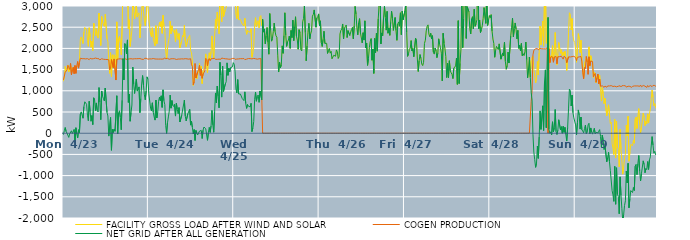
| Category | FACILITY GROSS LOAD AFTER WIND AND SOLAR | COGEN PRODUCTION | NET GRID AFTER ALL GENERATION |
|---|---|---|---|
|  Mon  4/23 | 1224 | 1258 | -34 |
|  Mon  4/23 | 1324 | 1263 | 61 |
|  Mon  4/23 | 1573 | 1440 | 133 |
|  Mon  4/23 | 1458 | 1420 | 38 |
|  Mon  4/23 | 1492 | 1490 | 2 |
|  Mon  4/23 | 1609 | 1601 | 8 |
|  Mon  4/23 | 1447 | 1546 | -99 |
|  Mon  4/23 | 1487 | 1502 | -15 |
|  Mon  4/23 | 1619 | 1644 | -25 |
|  Mon  4/23 | 1433 | 1376 | 57 |
|  Mon  4/23 | 1487 | 1495 | -8 |
|  Mon  4/23 | 1557 | 1555 | 2 |
|  Mon  4/23 | 1492 | 1404 | 88 |
|  Mon  4/23 | 1419 | 1596 | -177 |
|  Mon  4/23 | 1540 | 1411 | 129 |
|  Mon  4/23 | 1575 | 1593 | -18 |
|  Mon  4/23 | 1581 | 1691 | -110 |
|  Mon  4/23 | 1616 | 1535 | 81 |
|  Mon  4/23 | 1682 | 1666 | 16 |
|  Mon  4/23 | 2218 | 1769 | 449 |
|  Mon  4/23 | 2270 | 1766 | 504 |
|  Mon  4/23 | 2256 | 1757 | 499 |
|  Mon  4/23 | 2114 | 1761 | 353 |
|  Mon  4/23 | 2384 | 1758 | 626 |
|  Mon  4/23 | 2494 | 1753 | 741 |
|  Mon  4/23 | 2471 | 1752 | 719 |
|  Mon  4/23 | 2440 | 1757 | 683 |
|  Mon  4/23 | 2184 | 1759 | 425 |
|  Mon  4/23 | 2049 | 1754 | 295 |
|  Mon  4/23 | 2487 | 1735 | 752 |
|  Mon  4/23 | 2272 | 1766 | 506 |
|  Mon  4/23 | 2027 | 1745 | 282 |
|  Mon  4/23 | 2168 | 1752 | 416 |
|  Mon  4/23 | 1950 | 1747 | 203 |
|  Mon  4/23 | 2594 | 1759 | 835 |
|  Mon  4/23 | 2545 | 1757 | 788 |
|  Mon  4/23 | 2304 | 1772 | 532 |
|  Mon  4/23 | 2463 | 1749 | 714 |
|  Mon  4/23 | 2291 | 1760 | 531 |
|  Mon  4/23 | 2243 | 1742 | 501 |
|  Mon  4/23 | 2831 | 1754 | 1077 |
|  Mon  4/23 | 2462 | 1730 | 732 |
|  Mon  4/23 | 2067 | 1749 | 318 |
|  Mon  4/23 | 2753 | 1757 | 996 |
|  Mon  4/23 | 2625 | 1754 | 871 |
|  Mon  4/23 | 2557 | 1744 | 813 |
|  Mon  4/23 | 2520 | 1759 | 761 |
|  Mon  4/23 | 2805 | 1740 | 1065 |
|  Mon  4/23 | 2821 | 1747 | 1074 |
|  Mon  4/23 | 2226 | 1738 | 488 |
|  Mon  4/23 | 2161 | 1755 | 406 |
|  Mon  4/23 | 1663 | 1731 | -68 |
|  Mon  4/23 | 1410 | 1495 | -85 |
|  Mon  4/23 | 1898 | 1528 | 370 |
|  Mon  4/23 | 1334 | 1737 | -403 |
|  Mon  4/23 | 1848 | 1758 | 90 |
|  Mon  4/23 | 1560 | 1546 | 14 |
|  Mon  4/23 | 1849 | 1751 | 98 |
|  Mon  4/23 | 1805 | 1761 | 44 |
|  Mon  4/23 | 1285 | 1254 | 31 |
|  Mon  4/23 | 2626 | 1743 | 883 |
|  Mon  4/23 | 1738 | 1755 | -17 |
|  Mon  4/23 | 2224 | 1750 | 474 |
|  Mon  4/23 | 2280 | 1752 | 528 |
|  Mon  4/23 | 2127 | 1755 | 372 |
|  Mon  4/23 | 1849 | 1768 | 81 |
|  Mon  4/23 | 2524 | 1747 | 777 |
|  Mon  4/23 | 3503 | 1745 | 1758 |
|  Mon  4/23 | 3002 | 1745 | 1257 |
|  Mon  4/23 | 3884 | 1770 | 2114 |
|  Mon  4/23 | 3828 | 1743 | 2085 |
|  Mon  4/23 | 3609 | 1740 | 1869 |
|  Mon  4/23 | 3942 | 1742 | 2200 |
|  Mon  4/23 | 2467 | 1741 | 726 |
|  Mon  4/23 | 2677 | 1753 | 924 |
|  Mon  4/23 | 2046 | 1764 | 282 |
|  Mon  4/23 | 2242 | 1757 | 485 |
|  Mon  4/23 | 2431 | 1766 | 665 |
|  Mon  4/23 | 3309 | 1750 | 1559 |
|  Mon  4/23 | 2907 | 1746 | 1161 |
|  Mon  4/23 | 2694 | 1757 | 937 |
|  Mon  4/23 | 2708 | 1753 | 955 |
|  Mon  4/23 | 3032 | 1756 | 1276 |
|  Mon  4/23 | 2739 | 1747 | 992 |
|  Mon  4/23 | 2803 | 1758 | 1045 |
|  Mon  4/23 | 2839 | 1747 | 1092 |
|  Mon  4/23 | 2246 | 1761 | 485 |
|  Mon  4/23 | 2583 | 1764 | 819 |
|  Mon  4/23 | 2907 | 1746 | 1161 |
|  Mon  4/23 | 3126 | 1766 | 1360 |
|  Mon  4/23 | 2872 | 1739 | 1133 |
|  Mon  4/23 | 2668 | 1763 | 905 |
|  Mon  4/23 | 2533 | 1746 | 787 |
|  Mon  4/23 | 2763 | 1767 | 996 |
|  Mon  4/23 | 3099 | 1770 | 1329 |
|  Mon  4/23 | 3019 | 1746 | 1273 |
|  Tue  4/24 | 2692 | 1763 | 929 |
|  Tue  4/24 | 2679 | 1753 | 926 |
|  Tue  4/24 | 2330 | 1738 | 592 |
|  Tue  4/24 | 2276 | 1752 | 524 |
|  Tue  4/24 | 2486 | 1769 | 717 |
|  Tue  4/24 | 2255 | 1761 | 494 |
|  Tue  4/24 | 2138 | 1753 | 385 |
|  Tue  4/24 | 2060 | 1751 | 309 |
|  Tue  4/24 | 2536 | 1754 | 782 |
|  Tue  4/24 | 2108 | 1749 | 359 |
|  Tue  4/24 | 2256 | 1765 | 491 |
|  Tue  4/24 | 2502 | 1748 | 754 |
|  Tue  4/24 | 2614 | 1765 | 849 |
|  Tue  4/24 | 2516 | 1749 | 767 |
|  Tue  4/24 | 2634 | 1752 | 882 |
|  Tue  4/24 | 2355 | 1747 | 608 |
|  Tue  4/24 | 2782 | 1759 | 1023 |
|  Tue  4/24 | 2518 | 1754 | 764 |
|  Tue  4/24 | 2454 | 1779 | 675 |
|  Tue  4/24 | 1933 | 1755 | 178 |
|  Tue  4/24 | 1751 | 1756 | -5 |
|  Tue  4/24 | 2009 | 1765 | 244 |
|  Tue  4/24 | 2146 | 1762 | 384 |
|  Tue  4/24 | 2263 | 1743 | 520 |
|  Tue  4/24 | 2641 | 1743 | 898 |
|  Tue  4/24 | 2345 | 1755 | 590 |
|  Tue  4/24 | 2534 | 1763 | 771 |
|  Tue  4/24 | 2412 | 1757 | 655 |
|  Tue  4/24 | 2375 | 1746 | 629 |
|  Tue  4/24 | 2436 | 1755 | 681 |
|  Tue  4/24 | 2150 | 1746 | 404 |
|  Tue  4/24 | 2445 | 1739 | 706 |
|  Tue  4/24 | 2306 | 1742 | 564 |
|  Tue  4/24 | 2210 | 1749 | 461 |
|  Tue  4/24 | 2351 | 1746 | 605 |
|  Tue  4/24 | 2013 | 1749 | 264 |
|  Tue  4/24 | 2030 | 1764 | 266 |
|  Tue  4/24 | 2177 | 1754 | 423 |
|  Tue  4/24 | 2306 | 1760 | 546 |
|  Tue  4/24 | 2275 | 1751 | 524 |
|  Tue  4/24 | 2546 | 1765 | 781 |
|  Tue  4/24 | 2161 | 1758 | 403 |
|  Tue  4/24 | 2039 | 1749 | 290 |
|  Tue  4/24 | 2022 | 1753 | 269 |
|  Tue  4/24 | 2223 | 1758 | 465 |
|  Tue  4/24 | 2214 | 1746 | 468 |
|  Tue  4/24 | 2306 | 1742 | 564 |
|  Tue  4/24 | 1948 | 1757 | 191 |
|  Tue  4/24 | 1897 | 1614 | 283 |
|  Tue  4/24 | 1714 | 1578 | 136 |
|  Tue  4/24 | 1126 | 1145 | -19 |
|  Tue  4/24 | 1296 | 1210 | 86 |
|  Tue  4/24 | 1471 | 1643 | -172 |
|  Tue  4/24 | 1368 | 1303 | 65 |
|  Tue  4/24 | 1282 | 1280 | 2 |
|  Tue  4/24 | 1410 | 1450 | -40 |
|  Tue  4/24 | 1443 | 1506 | -63 |
|  Tue  4/24 | 1652 | 1603 | 49 |
|  Tue  4/24 | 1419 | 1364 | 55 |
|  Tue  4/24 | 1582 | 1516 | 66 |
|  Tue  4/24 | 1170 | 1295 | -125 |
|  Tue  4/24 | 1464 | 1394 | 70 |
|  Tue  4/24 | 1520 | 1374 | 146 |
|  Tue  4/24 | 1605 | 1468 | 137 |
|  Tue  4/24 | 1870 | 1766 | 104 |
|  Tue  4/24 | 1850 | 1742 | 108 |
|  Tue  4/24 | 1422 | 1590 | -168 |
|  Tue  4/24 | 1752 | 1737 | 15 |
|  Tue  4/24 | 1897 | 1761 | 136 |
|  Tue  4/24 | 1727 | 1708 | 19 |
|  Tue  4/24 | 1927 | 1755 | 172 |
|  Tue  4/24 | 2294 | 1757 | 537 |
|  Tue  4/24 | 1956 | 1760 | 196 |
|  Tue  4/24 | 1774 | 1752 | 22 |
|  Tue  4/24 | 2279 | 1766 | 513 |
|  Tue  4/24 | 2690 | 1741 | 949 |
|  Tue  4/24 | 2463 | 1748 | 715 |
|  Tue  4/24 | 2854 | 1743 | 1111 |
|  Tue  4/24 | 2636 | 1757 | 879 |
|  Tue  4/24 | 2345 | 1747 | 598 |
|  Tue  4/24 | 3431 | 1759 | 1672 |
|  Tue  4/24 | 3113 | 1743 | 1370 |
|  Tue  4/24 | 2624 | 1773 | 851 |
|  Tue  4/24 | 3351 | 1771 | 1580 |
|  Tue  4/24 | 2746 | 1762 | 984 |
|  Tue  4/24 | 2755 | 1752 | 1003 |
|  Tue  4/24 | 2916 | 1755 | 1161 |
|  Tue  4/24 | 2957 | 1743 | 1214 |
|  Tue  4/24 | 3411 | 1752 | 1659 |
|  Tue  4/24 | 3107 | 1743 | 1364 |
|  Tue  4/24 | 3280 | 1745 | 1535 |
|  Tue  4/24 | 3212 | 1766 | 1446 |
|  Tue  4/24 | 3293 | 1746 | 1547 |
|  Tue  4/24 | 3309 | 1746 | 1563 |
|  Tue  4/24 | 3326 | 1762 | 1564 |
|  Tue  4/24 | 3428 | 1764 | 1664 |
|  Wed  4/25 | 3392 | 1766 | 1626 |
|  Wed  4/25 | 3204 | 1742 | 1462 |
|  Wed  4/25 | 2805 | 1760 | 1045 |
|  Wed  4/25 | 2700 | 1749 | 951 |
|  Wed  4/25 | 3020 | 1756 | 1264 |
|  Wed  4/25 | 2677 | 1752 | 925 |
|  Wed  4/25 | 2658 | 1753 | 905 |
|  Wed  4/25 | 2682 | 1758 | 924 |
|  Wed  4/25 | 2687 | 1754 | 933 |
|  Wed  4/25 | 2577 | 1757 | 820 |
|  Wed  4/25 | 2563 | 1755 | 808 |
|  Wed  4/25 | 2529 | 1761 | 768 |
|  Wed  4/25 | 2711 | 1736 | 975 |
|  Wed  4/25 | 2457 | 1758 | 699 |
|  Wed  4/25 | 2332 | 1747 | 585 |
|  Wed  4/25 | 2427 | 1750 | 677 |
|  Wed  4/25 | 2398 | 1761 | 637 |
|  Wed  4/25 | 2405 | 1757 | 648 |
|  Wed  4/25 | 2380 | 1759 | 621 |
|  Wed  4/25 | 2465 | 1760 | 705 |
|  Wed  4/25 | 1791 | 1753 | 38 |
|  Wed  4/25 | 1892 | 1770 | 122 |
|  Wed  4/25 | 2039 | 1764 | 275 |
|  Wed  4/25 | 2548 | 1748 | 800 |
|  Wed  4/25 | 2725 | 1755 | 970 |
|  Wed  4/25 | 2515 | 1761 | 754 |
|  Wed  4/25 | 2613 | 1746 | 867 |
|  Wed  4/25 | 2656 | 1755 | 901 |
|  Wed  4/25 | 2483 | 1755 | 728 |
|  Wed  4/25 | 2745 | 1749 | 996 |
|  Wed  4/25 | 2774 | 1760 | 1014 |
|  Wed  4/25 | 2540 | 1749 | 791 |
|  Wed  4/25 | 2685 | 0 | 2685 |
|  Wed  4/25 | 2384 | 0 | 2384 |
|  Wed  4/25 | 2459 | 0 | 2459 |
|  Wed  4/25 | 2108 | 0 | 2108 |
|  Wed  4/25 | 2300 | 0 | 2300 |
|  Wed  4/25 | 2490 | 0 | 2490 |
|  Wed  4/25 | 2143 | 0 | 2143 |
|  Wed  4/25 | 1863 | 0 | 1863 |
|  Wed  4/25 | 2821 | 0 | 2821 |
|  Wed  4/25 | 2436 | 0 | 2436 |
|  Wed  4/25 | 2171 | 0 | 2171 |
|  Wed  4/25 | 2232 | 0 | 2232 |
|  Wed  4/25 | 2396 | 0 | 2396 |
|  Wed  4/25 | 2596 | 0 | 2596 |
|  Wed  4/25 | 2396 | 0 | 2396 |
|  Wed  4/25 | 2298 | 0 | 2298 |
|  Wed  4/25 | 2264 | 0 | 2264 |
|  Wed  4/25 | 1840 | 0 | 1840 |
|  Wed  4/25 | 1443 | 0 | 1443 |
|  Wed  4/25 | 1678 | 0 | 1678 |
|  Wed  4/25 | 1542 | 0 | 1542 |
|  Wed  4/25 | 1613 | 0 | 1613 |
|  Wed  4/25 | 2060 | 0 | 2060 |
|  Wed  4/25 | 1884 | 0 | 1884 |
|  Wed  4/25 | 2302 | 0 | 2302 |
|  Wed  4/25 | 2840 | 0 | 2840 |
|  Wed  4/25 | 2311 | 0 | 2311 |
|  Wed  4/25 | 2048 | 0 | 2048 |
|  Wed  4/25 | 2153 | 0 | 2153 |
|  Wed  4/25 | 2199 | 0 | 2199 |
|  Wed  4/25 | 2290 | 0 | 2290 |
|  Wed  4/25 | 2003 | 0 | 2003 |
|  Wed  4/25 | 2423 | 0 | 2423 |
|  Wed  4/25 | 2255 | 0 | 2255 |
|  Wed  4/25 | 2665 | 0 | 2665 |
|  Wed  4/25 | 2183 | 0 | 2183 |
|  Wed  4/25 | 2504 | 0 | 2504 |
|  Wed  4/25 | 2746 | 0 | 2746 |
|  Wed  4/25 | 2289 | 0 | 2289 |
|  Wed  4/25 | 2198 | 0 | 2198 |
|  Wed  4/25 | 1981 | 0 | 1981 |
|  Wed  4/25 | 2441 | 0 | 2441 |
|  Wed  4/25 | 2371 | 0 | 2371 |
|  Wed  4/25 | 1969 | 0 | 1969 |
|  Wed  4/25 | 1939 | 0 | 1939 |
|  Wed  4/25 | 2625 | 0 | 2625 |
|  Wed  4/25 | 2708 | 0 | 2708 |
|  Wed  4/25 | 3004 | 0 | 3004 |
|  Wed  4/25 | 2373 | 0 | 2373 |
|  Wed  4/25 | 1708 | 0 | 1708 |
|  Wed  4/25 | 2058 | 0 | 2058 |
|  Wed  4/25 | 2378 | 0 | 2378 |
|  Wed  4/25 | 2591 | 0 | 2591 |
|  Wed  4/25 | 2223 | 0 | 2223 |
|  Wed  4/25 | 2346 | 0 | 2346 |
|  Wed  4/25 | 2414 | 0 | 2414 |
|  Wed  4/25 | 2761 | 0 | 2761 |
|  Wed  4/25 | 2801 | 0 | 2801 |
|  Wed  4/25 | 2907 | 0 | 2907 |
|  Wed  4/25 | 2909 | 0 | 2909 |
|  Wed  4/25 | 2501 | 0 | 2501 |
|  Wed  4/25 | 2717 | 0 | 2717 |
|  Wed  4/25 | 2748 | 0 | 2748 |
|  Wed  4/25 | 2813 | 0 | 2813 |
|  Thu  4/26 | 2534 | 0 | 2534 |
|  Thu  4/26 | 2650 | 0 | 2650 |
|  Thu  4/26 | 2134 | 0 | 2134 |
|  Thu  4/26 | 2046 | 0 | 2046 |
|  Thu  4/26 | 2214 | 0 | 2214 |
|  Thu  4/26 | 2405 | 0 | 2405 |
|  Thu  4/26 | 2117 | 0 | 2117 |
|  Thu  4/26 | 2103 | 0 | 2103 |
|  Thu  4/26 | 2120 | 0 | 2120 |
|  Thu  4/26 | 1882 | 0 | 1882 |
|  Thu  4/26 | 1952 | 0 | 1952 |
|  Thu  4/26 | 1997 | 0 | 1997 |
|  Thu  4/26 | 1888 | 0 | 1888 |
|  Thu  4/26 | 1932 | 0 | 1932 |
|  Thu  4/26 | 1754 | 0 | 1754 |
|  Thu  4/26 | 1770 | 0 | 1770 |
|  Thu  4/26 | 1839 | 0 | 1839 |
|  Thu  4/26 | 1834 | 0 | 1834 |
|  Thu  4/26 | 1815 | 0 | 1815 |
|  Thu  4/26 | 1964 | 0 | 1964 |
|  Thu  4/26 | 1920 | 0 | 1920 |
|  Thu  4/26 | 1762 | 0 | 1762 |
|  Thu  4/26 | 1803 | 0 | 1803 |
|  Thu  4/26 | 2340 | 0 | 2340 |
|  Thu  4/26 | 2425 | 0 | 2425 |
|  Thu  4/26 | 2454 | 0 | 2454 |
|  Thu  4/26 | 2576 | 0 | 2576 |
|  Thu  4/26 | 2222 | 0 | 2222 |
|  Thu  4/26 | 2475 | 0 | 2475 |
|  Thu  4/26 | 2515 | 0 | 2515 |
|  Thu  4/26 | 2552 | 0 | 2552 |
|  Thu  4/26 | 2257 | 0 | 2257 |
|  Thu  4/26 | 2419 | 0 | 2419 |
|  Thu  4/26 | 2404 | 0 | 2404 |
|  Thu  4/26 | 2305 | 0 | 2305 |
|  Thu  4/26 | 2327 | 0 | 2327 |
|  Thu  4/26 | 2449 | 0 | 2449 |
|  Thu  4/26 | 2493 | 0 | 2493 |
|  Thu  4/26 | 2227 | 0 | 2227 |
|  Thu  4/26 | 2529 | 0 | 2529 |
|  Thu  4/26 | 2989 | 0 | 2989 |
|  Thu  4/26 | 2812 | 0 | 2812 |
|  Thu  4/26 | 2486 | 0 | 2486 |
|  Thu  4/26 | 2320 | 0 | 2320 |
|  Thu  4/26 | 2605 | 0 | 2605 |
|  Thu  4/26 | 2702 | 0 | 2702 |
|  Thu  4/26 | 2368 | 0 | 2368 |
|  Thu  4/26 | 2359 | 0 | 2359 |
|  Thu  4/26 | 2130 | 0 | 2130 |
|  Thu  4/26 | 2370 | 0 | 2370 |
|  Thu  4/26 | 2196 | 0 | 2196 |
|  Thu  4/26 | 2650 | 0 | 2650 |
|  Thu  4/26 | 2009 | 0 | 2009 |
|  Thu  4/26 | 2126 | 0 | 2126 |
|  Thu  4/26 | 1600 | 0 | 1600 |
|  Thu  4/26 | 1764 | 0 | 1764 |
|  Thu  4/26 | 2018 | 0 | 2018 |
|  Thu  4/26 | 2157 | 0 | 2157 |
|  Thu  4/26 | 2231 | 0 | 2231 |
|  Thu  4/26 | 1721 | 0 | 1721 |
|  Thu  4/26 | 1986 | 0 | 1986 |
|  Thu  4/26 | 1410 | 0 | 1410 |
|  Thu  4/26 | 2235 | 0 | 2235 |
|  Thu  4/26 | 1901 | 0 | 1901 |
|  Thu  4/26 | 2358 | 0 | 2358 |
|  Thu  4/26 | 1935 | 0 | 1935 |
|  Thu  4/26 | 2694 | 0 | 2694 |
|  Thu  4/26 | 3042 | 0 | 3042 |
|  Thu  4/26 | 3549 | 0 | 3549 |
|  Thu  4/26 | 2105 | 0 | 2105 |
|  Thu  4/26 | 2365 | 0 | 2365 |
|  Thu  4/26 | 2302 | 0 | 2302 |
|  Thu  4/26 | 2734 | 0 | 2734 |
|  Thu  4/26 | 2993 | 0 | 2993 |
|  Thu  4/26 | 2737 | 0 | 2737 |
|  Thu  4/26 | 2431 | 0 | 2431 |
|  Thu  4/26 | 2873 | 0 | 2873 |
|  Thu  4/26 | 2358 | 0 | 2358 |
|  Thu  4/26 | 2480 | 0 | 2480 |
|  Thu  4/26 | 2309 | 0 | 2309 |
|  Thu  4/26 | 2618 | 0 | 2618 |
|  Thu  4/26 | 2875 | 0 | 2875 |
|  Thu  4/26 | 2701 | 0 | 2701 |
|  Thu  4/26 | 2425 | 0 | 2425 |
|  Thu  4/26 | 2432 | 0 | 2432 |
|  Thu  4/26 | 2728 | 0 | 2728 |
|  Thu  4/26 | 2422 | 0 | 2422 |
|  Thu  4/26 | 2191 | 0 | 2191 |
|  Thu  4/26 | 2577 | 0 | 2577 |
|  Thu  4/26 | 2625 | 0 | 2625 |
|  Thu  4/26 | 2524 | 0 | 2524 |
|  Thu  4/26 | 2839 | 0 | 2839 |
|  Thu  4/26 | 2323 | 0 | 2323 |
|  Thu  4/26 | 2879 | 0 | 2879 |
|  Thu  4/26 | 2676 | 0 | 2676 |
|  Thu  4/26 | 2679 | 0 | 2679 |
|  Fri  4/27 | 2885 | 0 | 2885 |
|  Fri  4/27 | 3008 | 0 | 3008 |
|  Fri  4/27 | 2381 | 0 | 2381 |
|  Fri  4/27 | 1812 | 0 | 1812 |
|  Fri  4/27 | 1872 | 0 | 1872 |
|  Fri  4/27 | 1980 | 0 | 1980 |
|  Fri  4/27 | 2006 | 0 | 2006 |
|  Fri  4/27 | 2184 | 0 | 2184 |
|  Fri  4/27 | 1940 | 0 | 1940 |
|  Fri  4/27 | 1994 | 0 | 1994 |
|  Fri  4/27 | 1805 | 0 | 1805 |
|  Fri  4/27 | 1818 | 0 | 1818 |
|  Fri  4/27 | 2239 | 0 | 2239 |
|  Fri  4/27 | 2183 | 0 | 2183 |
|  Fri  4/27 | 1749 | 0 | 1749 |
|  Fri  4/27 | 1456 | 0 | 1456 |
|  Fri  4/27 | 1710 | 0 | 1710 |
|  Fri  4/27 | 1855 | 0 | 1855 |
|  Fri  4/27 | 1764 | 0 | 1764 |
|  Fri  4/27 | 1631 | 0 | 1631 |
|  Fri  4/27 | 1595 | 0 | 1595 |
|  Fri  4/27 | 1672 | 0 | 1672 |
|  Fri  4/27 | 2118 | 0 | 2118 |
|  Fri  4/27 | 2193 | 0 | 2193 |
|  Fri  4/27 | 2412 | 0 | 2412 |
|  Fri  4/27 | 2517 | 0 | 2517 |
|  Fri  4/27 | 2555 | 0 | 2555 |
|  Fri  4/27 | 2336 | 0 | 2336 |
|  Fri  4/27 | 2274 | 0 | 2274 |
|  Fri  4/27 | 2358 | 0 | 2358 |
|  Fri  4/27 | 2221 | 0 | 2221 |
|  Fri  4/27 | 2300 | 0 | 2300 |
|  Fri  4/27 | 1909 | 0 | 1909 |
|  Fri  4/27 | 1865 | 0 | 1865 |
|  Fri  4/27 | 2010 | 0 | 2010 |
|  Fri  4/27 | 1944 | 0 | 1944 |
|  Fri  4/27 | 1781 | 0 | 1781 |
|  Fri  4/27 | 1884 | 0 | 1884 |
|  Fri  4/27 | 2226 | 0 | 2226 |
|  Fri  4/27 | 2095 | 0 | 2095 |
|  Fri  4/27 | 2019 | 0 | 2019 |
|  Fri  4/27 | 1888 | 0 | 1888 |
|  Fri  4/27 | 1234 | 0 | 1234 |
|  Fri  4/27 | 2357 | 0 | 2357 |
|  Fri  4/27 | 2127 | 0 | 2127 |
|  Fri  4/27 | 1998 | 0 | 1998 |
|  Fri  4/27 | 1808 | 0 | 1808 |
|  Fri  4/27 | 1313 | 0 | 1313 |
|  Fri  4/27 | 1648 | 0 | 1648 |
|  Fri  4/27 | 1305 | 0 | 1305 |
|  Fri  4/27 | 1709 | 0 | 1709 |
|  Fri  4/27 | 1474 | 0 | 1474 |
|  Fri  4/27 | 1424 | 0 | 1424 |
|  Fri  4/27 | 1385 | 0 | 1385 |
|  Fri  4/27 | 1288 | 0 | 1288 |
|  Fri  4/27 | 1534 | 0 | 1534 |
|  Fri  4/27 | 1519 | 0 | 1519 |
|  Fri  4/27 | 1586 | 0 | 1586 |
|  Fri  4/27 | 1771 | 0 | 1771 |
|  Fri  4/27 | 1151 | 0 | 1151 |
|  Fri  4/27 | 2654 | 0 | 2654 |
|  Fri  4/27 | 1171 | 0 | 1171 |
|  Fri  4/27 | 1648 | 0 | 1648 |
|  Fri  4/27 | 1978 | 0 | 1978 |
|  Fri  4/27 | 3140 | 0 | 3140 |
|  Fri  4/27 | 2019 | 0 | 2019 |
|  Fri  4/27 | 2700 | 0 | 2700 |
|  Fri  4/27 | 2709 | 0 | 2709 |
|  Fri  4/27 | 4059 | 0 | 4059 |
|  Fri  4/27 | 2236 | 0 | 2236 |
|  Fri  4/27 | 2984 | 0 | 2984 |
|  Fri  4/27 | 2970 | 0 | 2970 |
|  Fri  4/27 | 2863 | 0 | 2863 |
|  Fri  4/27 | 2461 | 0 | 2461 |
|  Fri  4/27 | 2341 | 0 | 2341 |
|  Fri  4/27 | 2696 | 0 | 2696 |
|  Fri  4/27 | 2747 | 0 | 2747 |
|  Fri  4/27 | 2460 | 0 | 2460 |
|  Fri  4/27 | 2924 | 0 | 2924 |
|  Fri  4/27 | 2522 | 0 | 2522 |
|  Fri  4/27 | 2581 | 0 | 2581 |
|  Fri  4/27 | 2683 | 0 | 2683 |
|  Fri  4/27 | 4056 | 0 | 4056 |
|  Fri  4/27 | 2458 | 0 | 2458 |
|  Fri  4/27 | 2670 | 0 | 2670 |
|  Fri  4/27 | 2373 | 0 | 2373 |
|  Fri  4/27 | 2445 | 0 | 2445 |
|  Fri  4/27 | 2533 | 0 | 2533 |
|  Fri  4/27 | 2708 | 0 | 2708 |
|  Fri  4/27 | 2961 | 0 | 2961 |
|  Fri  4/27 | 2982 | 0 | 2982 |
|  Fri  4/27 | 2591 | 0 | 2591 |
|  Fri  4/27 | 3256 | 0 | 3256 |
|  Fri  4/27 | 2540 | 0 | 2540 |
|  Fri  4/27 | 2665 | 0 | 2665 |
|  Fri  4/27 | 2775 | 0 | 2775 |
|  Sat  4/28 | 2723 | 0 | 2723 |
|  Sat  4/28 | 2795 | 0 | 2795 |
|  Sat  4/28 | 2409 | 0 | 2409 |
|  Sat  4/28 | 2220 | 0 | 2220 |
|  Sat  4/28 | 2114 | 0 | 2114 |
|  Sat  4/28 | 1791 | 0 | 1791 |
|  Sat  4/28 | 1955 | 0 | 1955 |
|  Sat  4/28 | 2047 | 0 | 2047 |
|  Sat  4/28 | 2030 | 0 | 2030 |
|  Sat  4/28 | 1975 | 0 | 1975 |
|  Sat  4/28 | 2107 | 0 | 2107 |
|  Sat  4/28 | 2117 | 0 | 2117 |
|  Sat  4/28 | 1746 | 0 | 1746 |
|  Sat  4/28 | 1755 | 0 | 1755 |
|  Sat  4/28 | 1893 | 0 | 1893 |
|  Sat  4/28 | 1821 | 0 | 1821 |
|  Sat  4/28 | 2149 | 0 | 2149 |
|  Sat  4/28 | 1691 | 0 | 1691 |
|  Sat  4/28 | 1509 | 0 | 1509 |
|  Sat  4/28 | 1595 | 0 | 1595 |
|  Sat  4/28 | 1913 | 0 | 1913 |
|  Sat  4/28 | 1655 | 0 | 1655 |
|  Sat  4/28 | 1647 | 0 | 1647 |
|  Sat  4/28 | 2294 | 0 | 2294 |
|  Sat  4/28 | 2499 | 0 | 2499 |
|  Sat  4/28 | 2716 | 0 | 2716 |
|  Sat  4/28 | 2274 | 0 | 2274 |
|  Sat  4/28 | 2467 | 0 | 2467 |
|  Sat  4/28 | 2600 | 0 | 2600 |
|  Sat  4/28 | 2457 | 0 | 2457 |
|  Sat  4/28 | 2224 | 0 | 2224 |
|  Sat  4/28 | 2425 | 0 | 2425 |
|  Sat  4/28 | 2003 | 0 | 2003 |
|  Sat  4/28 | 2072 | 0 | 2072 |
|  Sat  4/28 | 1944 | 0 | 1944 |
|  Sat  4/28 | 2117 | 0 | 2117 |
|  Sat  4/28 | 1828 | 0 | 1828 |
|  Sat  4/28 | 1873 | 0 | 1873 |
|  Sat  4/28 | 1831 | 0 | 1831 |
|  Sat  4/28 | 1925 | 0 | 1925 |
|  Sat  4/28 | 2150 | 0 | 2150 |
|  Sat  4/28 | 1734 | 0 | 1734 |
|  Sat  4/28 | 1307 | 0 | 1307 |
|  Sat  4/28 | 1514 | 0 | 1514 |
|  Sat  4/28 | 1797 | 0 | 1797 |
|  Sat  4/28 | 1319 | 0 | 1319 |
|  Sat  4/28 | 1713 | 747 | 966 |
|  Sat  4/28 | 1788 | 1008 | 780 |
|  Sat  4/28 | 1821 | 1848 | -27 |
|  Sat  4/28 | 1510 | 1956 | -446 |
|  Sat  4/28 | 1350 | 1974 | -624 |
|  Sat  4/28 | 1184 | 1990 | -806 |
|  Sat  4/28 | 1296 | 2004 | -708 |
|  Sat  4/28 | 1691 | 1996 | -305 |
|  Sat  4/28 | 1372 | 1966 | -594 |
|  Sat  4/28 | 1893 | 1983 | -90 |
|  Sat  4/28 | 2527 | 2001 | 526 |
|  Sat  4/28 | 2084 | 1994 | 90 |
|  Sat  4/28 | 2068 | 1991 | 77 |
|  Sat  4/28 | 2645 | 2000 | 645 |
|  Sat  4/28 | 2052 | 1991 | 61 |
|  Sat  4/28 | 3200 | 1994 | 1206 |
|  Sat  4/28 | 3482 | 1988 | 1494 |
|  Sat  4/28 | 2119 | 1990 | 129 |
|  Sat  4/28 | 2161 | 2014 | 147 |
|  Sat  4/28 | 2729 | 0 | 2729 |
|  Sat  4/28 | 2081 | 1993 | 88 |
|  Sat  4/28 | 1662 | 1666 | -4 |
|  Sat  4/28 | 1827 | 1794 | 33 |
|  Sat  4/28 | 1779 | 1818 | -39 |
|  Sat  4/28 | 2063 | 1794 | 269 |
|  Sat  4/28 | 1707 | 1673 | 34 |
|  Sat  4/28 | 1920 | 1799 | 121 |
|  Sat  4/28 | 2375 | 1816 | 559 |
|  Sat  4/28 | 1844 | 1808 | 36 |
|  Sat  4/28 | 1607 | 1637 | -30 |
|  Sat  4/28 | 1872 | 1802 | 70 |
|  Sat  4/28 | 2139 | 1822 | 317 |
|  Sat  4/28 | 2118 | 1807 | 311 |
|  Sat  4/28 | 1887 | 1810 | 77 |
|  Sat  4/28 | 1967 | 1814 | 153 |
|  Sat  4/28 | 1820 | 1821 | -1 |
|  Sat  4/28 | 1909 | 1747 | 162 |
|  Sat  4/28 | 1832 | 1814 | 18 |
|  Sat  4/28 | 1931 | 1793 | 138 |
|  Sat  4/28 | 1750 | 1779 | -29 |
|  Sat  4/28 | 1478 | 1663 | -185 |
|  Sat  4/28 | 1783 | 1647 | 136 |
|  Sat  4/28 | 2372 | 1800 | 572 |
|  Sat  4/28 | 2841 | 1801 | 1040 |
|  Sat  4/28 | 2804 | 1798 | 1006 |
|  Sat  4/28 | 2435 | 1793 | 642 |
|  Sat  4/28 | 2704 | 1806 | 898 |
|  Sat  4/28 | 2295 | 1812 | 483 |
|  Sat  4/28 | 2175 | 1814 | 361 |
|  Sat  4/28 | 2142 | 1799 | 343 |
|  Sun  4/29 | 1978 | 1783 | 195 |
|  Sun  4/29 | 1673 | 1712 | -39 |
|  Sun  4/29 | 2032 | 1790 | 242 |
|  Sun  4/29 | 2349 | 1800 | 549 |
|  Sun  4/29 | 2230 | 1800 | 430 |
|  Sun  4/29 | 1900 | 1803 | 97 |
|  Sun  4/29 | 2191 | 1810 | 381 |
|  Sun  4/29 | 1760 | 1681 | 79 |
|  Sun  4/29 | 1475 | 1423 | 52 |
|  Sun  4/29 | 1295 | 1286 | 9 |
|  Sun  4/29 | 1659 | 1548 | 111 |
|  Sun  4/29 | 1715 | 1524 | 191 |
|  Sun  4/29 | 1798 | 1808 | -10 |
|  Sun  4/29 | 1698 | 1677 | 21 |
|  Sun  4/29 | 1583 | 1388 | 195 |
|  Sun  4/29 | 2036 | 1802 | 234 |
|  Sun  4/29 | 1581 | 1594 | -13 |
|  Sun  4/29 | 1828 | 1704 | 124 |
|  Sun  4/29 | 1749 | 1721 | 28 |
|  Sun  4/29 | 1667 | 1689 | -22 |
|  Sun  4/29 | 1309 | 1330 | -21 |
|  Sun  4/29 | 1442 | 1328 | 114 |
|  Sun  4/29 | 1398 | 1410 | -12 |
|  Sun  4/29 | 1187 | 1202 | -15 |
|  Sun  4/29 | 1332 | 1306 | 26 |
|  Sun  4/29 | 1395 | 1395 | 0 |
|  Sun  4/29 | 1208 | 1161 | 47 |
|  Sun  4/29 | 1361 | 1277 | 84 |
|  Sun  4/29 | 1029 | 1108 | -79 |
|  Sun  4/29 | 758 | 1085 | -327 |
|  Sun  4/29 | 1074 | 1117 | -43 |
|  Sun  4/29 | 937 | 1118 | -181 |
|  Sun  4/29 | 696 | 1080 | -384 |
|  Sun  4/29 | 824 | 1112 | -288 |
|  Sun  4/29 | 845 | 1113 | -268 |
|  Sun  4/29 | 411 | 1084 | -673 |
|  Sun  4/29 | 541 | 1115 | -574 |
|  Sun  4/29 | 670 | 1118 | -448 |
|  Sun  4/29 | 451 | 1114 | -663 |
|  Sun  4/29 | 224 | 1101 | -877 |
|  Sun  4/29 | 262 | 1122 | -860 |
|  Sun  4/29 | -244 | 1109 | -1353 |
|  Sun  4/29 | -353 | 1102 | -1455 |
|  Sun  4/29 | -504 | 1104 | -1608 |
|  Sun  4/29 | 325 | 1109 | -784 |
|  Sun  4/29 | -581 | 1095 | -1676 |
|  Sun  4/29 | 278 | 1093 | -815 |
|  Sun  4/29 | -324 | 1115 | -1439 |
|  Sun  4/29 | -386 | 1108 | -1494 |
|  Sun  4/29 | -794 | 1107 | -1901 |
|  Sun  4/29 | 89 | 1119 | -1030 |
|  Sun  4/29 | -373 | 1092 | -1465 |
|  Sun  4/29 | -657 | 1119 | -1776 |
|  Sun  4/29 | -966 | 1113 | -2079 |
|  Sun  4/29 | -795 | 1122 | -1917 |
|  Sun  4/29 | -592 | 1112 | -1704 |
|  Sun  4/29 | -475 | 1118 | -1593 |
|  Sun  4/29 | 193 | 1087 | -894 |
|  Sun  4/29 | -64 | 1110 | -1174 |
|  Sun  4/29 | 399 | 1108 | -709 |
|  Sun  4/29 | -661 | 1099 | -1760 |
|  Sun  4/29 | -441 | 1105 | -1546 |
|  Sun  4/29 | -266 | 1087 | -1353 |
|  Sun  4/29 | -250 | 1081 | -1331 |
|  Sun  4/29 | -294 | 1105 | -1399 |
|  Sun  4/29 | -169 | 1112 | -1281 |
|  Sun  4/29 | -236 | 1115 | -1351 |
|  Sun  4/29 | 336 | 1112 | -776 |
|  Sun  4/29 | 380 | 1114 | -734 |
|  Sun  4/29 | 112 | 1091 | -979 |
|  Sun  4/29 | 395 | 1115 | -720 |
|  Sun  4/29 | 580 | 1107 | -527 |
|  Sun  4/29 | 210 | 1104 | -894 |
|  Sun  4/29 | 12 | 1137 | -1125 |
|  Sun  4/29 | 141 | 1094 | -953 |
|  Sun  4/29 | 164 | 1098 | -934 |
|  Sun  4/29 | 473 | 1125 | -652 |
|  Sun  4/29 | 385 | 1123 | -738 |
|  Sun  4/29 | 177 | 1110 | -933 |
|  Sun  4/29 | 288 | 1122 | -834 |
|  Sun  4/29 | 221 | 1079 | -858 |
|  Sun  4/29 | 456 | 1125 | -669 |
|  Sun  4/29 | 240 | 1095 | -855 |
|  Sun  4/29 | 460 | 1091 | -631 |
|  Sun  4/29 | 565 | 1124 | -559 |
|  Sun  4/29 | 813 | 1114 | -301 |
|  Sun  4/29 | 1018 | 1099 | -81 |
|  Sun  4/29 | 849 | 1127 | -278 |
|  Sun  4/29 | 647 | 1119 | -472 |
|  Sun  4/29 | 697 | 1125 | -428 |
|  Sun  4/29 | 613 | 1126 | -513 |
|  Sun  4/29 | 559 | 1091 | -532 |